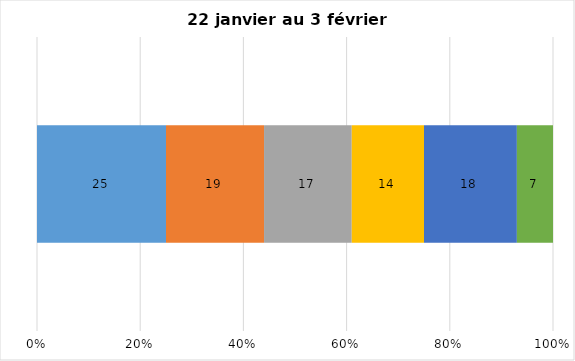
| Category | Plusieurs fois par jour | Une fois par jour | Quelques fois par semaine   | Une fois par semaine ou moins   |  Jamais   |  Je n’utilise pas les médias sociaux |
|---|---|---|---|---|---|---|
| 0 | 25 | 19 | 17 | 14 | 18 | 7 |